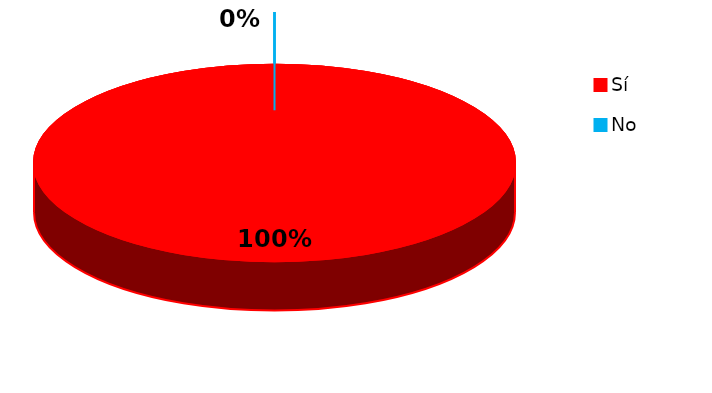
| Category | Series 0 |
|---|---|
| 0 | 18 |
| 1 | 0 |